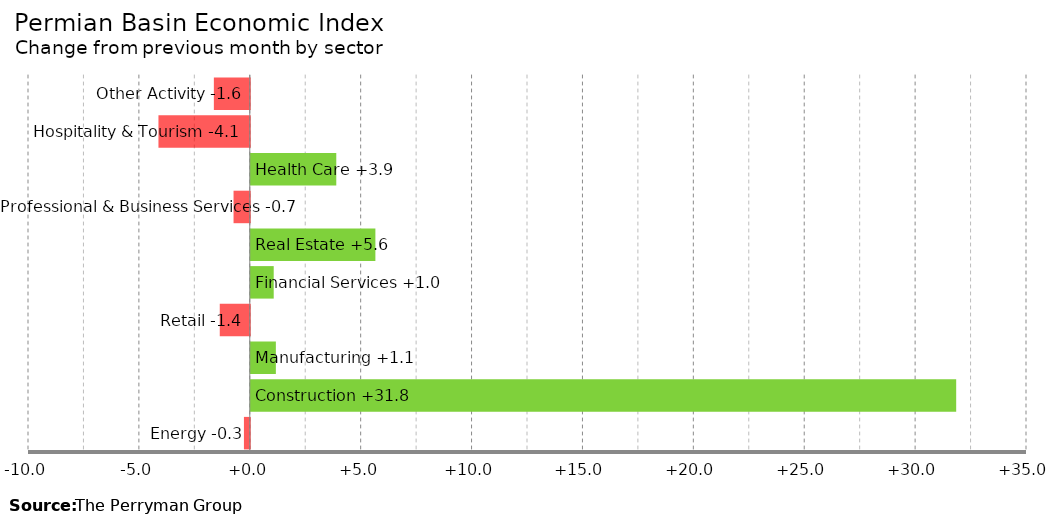
| Category | Change |
|---|---|
| Energy | -0.264 |
| Construction | 31.807 |
| Manufacturing | 1.131 |
| Retail | -1.354 |
| Financial Services | 1.034 |
| Real Estate | 5.619 |
| Professional & Business Services | -0.732 |
| Health Care | 3.855 |
| Hospitality & Tourism | -4.118 |
| Other Activity | -1.619 |